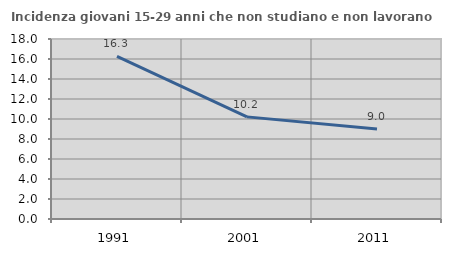
| Category | Incidenza giovani 15-29 anni che non studiano e non lavorano  |
|---|---|
| 1991.0 | 16.271 |
| 2001.0 | 10.213 |
| 2011.0 | 8.995 |